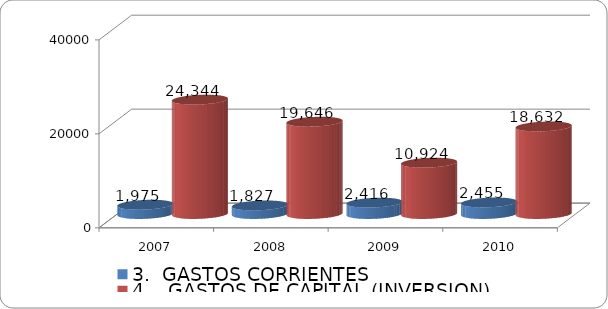
| Category | 3.  GASTOS CORRIENTES | 4.   GASTOS DE CAPITAL (INVERSION) |
|---|---|---|
| 2007 | 1974.752 | 24344.182 |
| 2008 | 1827.39 | 19645.914 |
| 2009 | 2415.908 | 10923.578 |
| 2010 | 2454.666 | 18632.376 |